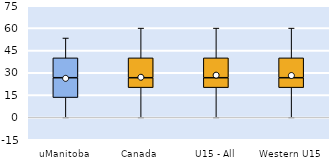
| Category | 25th | 50th | 75th |
|---|---|---|---|
| uManitoba | 13.333 | 13.333 | 13.333 |
| Canada | 20 | 6.667 | 13.333 |
| U15 - All | 20 | 6.667 | 13.333 |
| Western U15 | 20 | 6.667 | 13.333 |